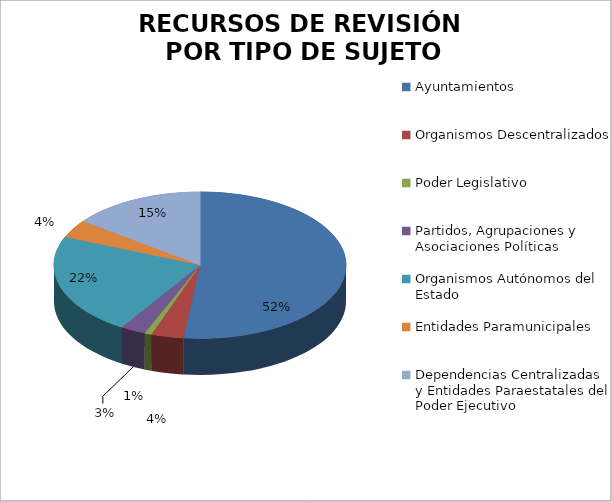
| Category | Series 0 |
|---|---|
| Ayuntamientos | 130 |
| Organismos Descentralizados | 9 |
| Poder Legislativo | 2 |
| Partidos, Agrupaciones y Asociaciones Políticas | 7 |
| Organismos Autónomos del Estado | 56 |
| Entidades Paramunicipales | 10 |
| Dependencias Centralizadas y Entidades Paraestatales del Poder Ejecutivo | 37 |